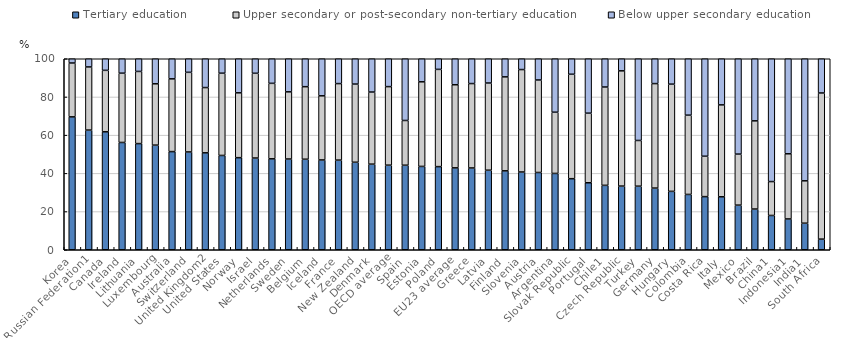
| Category | Tertiary education | Upper secondary or post-secondary non-tertiary education | Below upper secondary education |
|---|---|---|---|
| Korea | 69.574 | 28.2 | 2.226 |
| Russian Federation1 | 62.658 | 33.057 | 4.285 |
| Canada | 61.754 | 32.181 | 6.065 |
| Ireland | 56.174 | 36.267 | 7.558 |
| Lithuania | 55.581 | 37.777 | 6.642 |
| Luxembourg | 54.78 | 32.112 | 13.107 |
| Australia | 51.393 | 38.081 | 10.526 |
| Switzerland | 51.207 | 41.684 | 7.109 |
| United Kingdom2 | 50.753 | 34.163 | 15.085 |
| United States | 49.374 | 43.062 | 7.564 |
| Norway | 48.212 | 33.947 | 17.842 |
| Israel | 48.028 | 44.365 | 7.607 |
| Netherlands | 47.603 | 39.523 | 12.874 |
| Sweden | 47.51 | 35.17 | 17.32 |
| Belgium | 47.397 | 37.979 | 14.624 |
| Iceland | 47.014 | 33.576 | 19.409 |
| France | 46.938 | 40.059 | 13.003 |
| New Zealand | 45.812 | 40.933 | 13.256 |
| Denmark | 44.82 | 37.754 | 17.426 |
| OECD average | 44.285 | 41.129 | 15.043 |
| Spain | 44.26 | 23.424 | 32.316 |
| Estonia | 43.634 | 44.298 | 12.069 |
| Poland | 43.524 | 50.92 | 5.557 |
| EU23 average | 42.875 | 43.52 | 13.605 |
| Greece | 42.822 | 44.192 | 12.986 |
| Latvia | 41.649 | 45.647 | 12.704 |
| Finland | 41.314 | 49.197 | 9.489 |
| Slovenia | 40.713 | 53.63 | 5.657 |
| Austria | 40.458 | 48.426 | 11.116 |
| Argentina | 39.958 | 32.053 | 27.989 |
| Slovak Republic | 37.209 | 54.679 | 8.112 |
| Portugal | 35.078 | 36.431 | 28.491 |
| Chile1 | 33.726 | 51.477 | 14.797 |
| Czech Republic | 33.329 | 60.345 | 6.326 |
| Turkey | 33.28 | 23.94 | 42.78 |
| Germany | 32.282 | 54.719 | 12.999 |
| Hungary | 30.577 | 56.123 | 13.301 |
| Colombia | 28.96 | 41.501 | 29.54 |
| Costa Rica | 27.816 | 21.148 | 51.036 |
| Italy | 27.727 | 48.132 | 24.142 |
| Mexico | 23.359 | 26.716 | 49.925 |
| Brazil | 21.315 | 46.174 | 32.511 |
| China1 | 17.949 | 17.748 | 64.304 |
| Indonesia1 | 16.13 | 34.112 | 49.758 |
| India1 | 13.9 | 22.186 | 63.914 |
| South Africa | 5.569 | 76.512 | 17.919 |